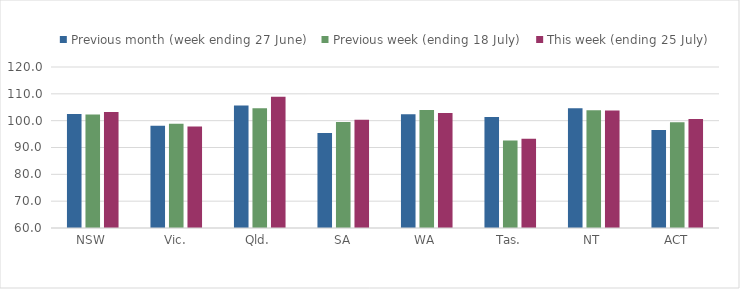
| Category | Previous month (week ending 27 June) | Previous week (ending 18 July) | This week (ending 25 July) |
|---|---|---|---|
| NSW | 102.481 | 102.313 | 103.268 |
| Vic. | 98.143 | 98.864 | 97.865 |
| Qld. | 105.655 | 104.598 | 108.887 |
| SA | 95.397 | 99.535 | 100.301 |
| WA | 102.421 | 103.941 | 102.855 |
| Tas. | 101.411 | 92.607 | 93.307 |
| NT | 104.612 | 103.926 | 103.814 |
| ACT | 96.484 | 99.436 | 100.628 |